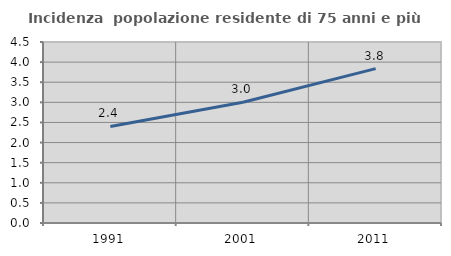
| Category | Incidenza  popolazione residente di 75 anni e più |
|---|---|
| 1991.0 | 2.4 |
| 2001.0 | 3.003 |
| 2011.0 | 3.837 |